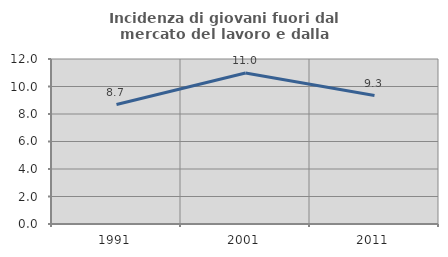
| Category | Incidenza di giovani fuori dal mercato del lavoro e dalla formazione  |
|---|---|
| 1991.0 | 8.685 |
| 2001.0 | 10.983 |
| 2011.0 | 9.343 |